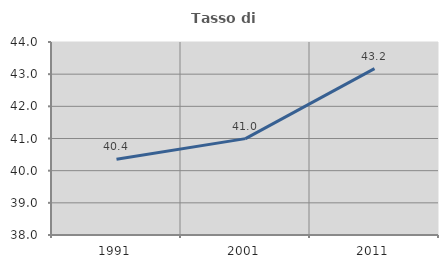
| Category | Tasso di occupazione   |
|---|---|
| 1991.0 | 40.354 |
| 2001.0 | 40.996 |
| 2011.0 | 43.171 |